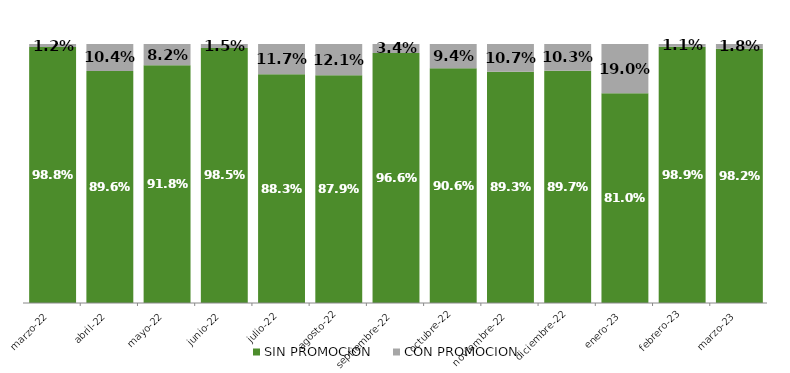
| Category | SIN PROMOCION   | CON PROMOCION   |
|---|---|---|
| 2022-03-01 | 0.988 | 0.012 |
| 2022-04-01 | 0.896 | 0.104 |
| 2022-05-01 | 0.918 | 0.082 |
| 2022-06-01 | 0.985 | 0.015 |
| 2022-07-01 | 0.883 | 0.117 |
| 2022-08-01 | 0.879 | 0.121 |
| 2022-09-01 | 0.966 | 0.034 |
| 2022-10-01 | 0.906 | 0.094 |
| 2022-11-01 | 0.893 | 0.107 |
| 2022-12-01 | 0.897 | 0.103 |
| 2023-01-01 | 0.81 | 0.19 |
| 2023-02-01 | 0.989 | 0.011 |
| 2023-03-01 | 0.982 | 0.018 |